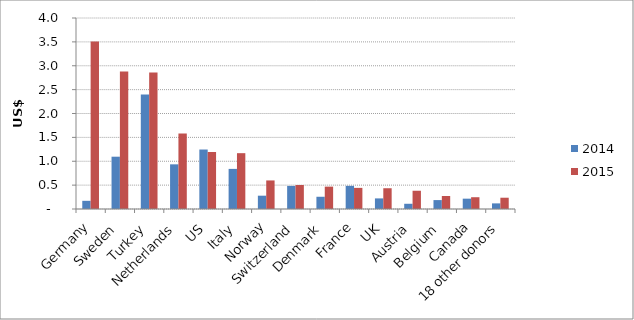
| Category | 2014 | 2015 |
|---|---|---|
| Germany | 0.171 | 3.51 |
| Sweden | 1.095 | 2.881 |
| Turkey | 2.396 | 2.856 |
| Netherlands | 0.935 | 1.581 |
| US | 1.246 | 1.194 |
| Italy | 0.84 | 1.169 |
| Norway | 0.279 | 0.598 |
| Switzerland | 0.483 | 0.503 |
| Denmark | 0.256 | 0.469 |
| France | 0.485 | 0.442 |
| UK | 0.222 | 0.435 |
| Austria | 0.109 | 0.382 |
| Belgium | 0.187 | 0.272 |
| Canada | 0.216 | 0.247 |
| 18 other donors | 0.118 | 0.236 |